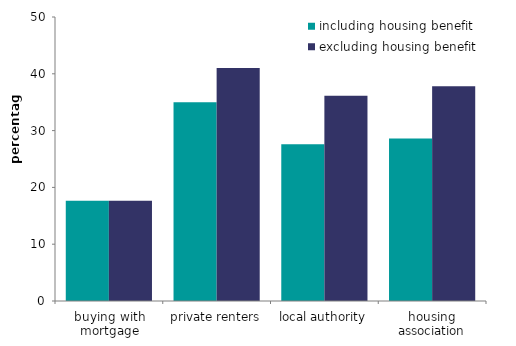
| Category | including housing benefit | excluding housing benefit |
|---|---|---|
| buying with mortgage | 17.661 | 17.661 |
| private renters | 35 | 41 |
| local authority | 27.6 | 36.145 |
| housing association | 28.6 | 37.793 |